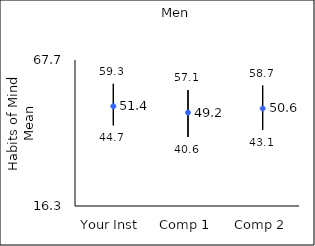
| Category | 25th percentile | 75th percentile | Mean |
|---|---|---|---|
| Your Inst | 44.7 | 59.3 | 51.43 |
| Comp 1 | 40.6 | 57.1 | 49.18 |
| Comp 2 | 43.1 | 58.7 | 50.63 |